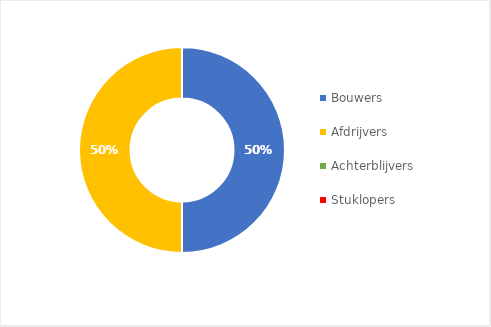
| Category | Series 0 |
|---|---|
| Bouwers | 0.5 |
| Afdrijvers | 0.5 |
| Achterblijvers | 0 |
| Stuklopers | 0 |